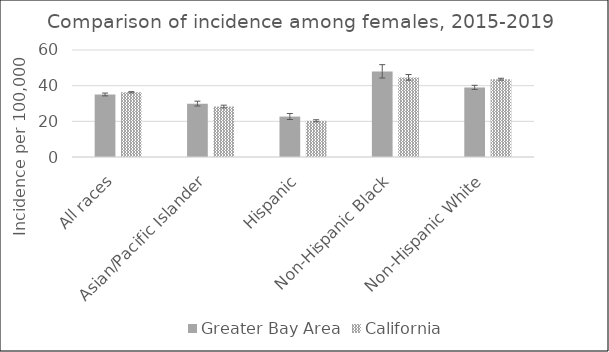
| Category | Greater Bay Area | California | SEER 18 |
|---|---|---|---|
| All races | 35.06 | 36.29 |  |
| Asian/Pacific Islander | 29.92 | 28.29 |  |
| Hispanic | 22.66 | 20.32 |  |
| Non-Hispanic Black | 47.91 | 44.63 |  |
| Non-Hispanic White | 39.03 | 43.63 |  |